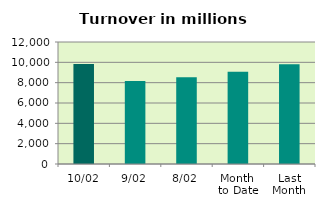
| Category | Series 0 |
|---|---|
| 10/02 | 9824.975 |
| 9/02 | 8173.6 |
| 8/02 | 8542.982 |
| Month 
to Date | 9080.615 |
| Last
Month | 9809.456 |